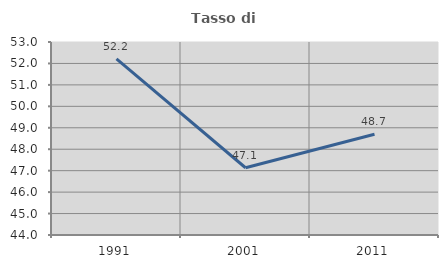
| Category | Tasso di occupazione   |
|---|---|
| 1991.0 | 52.215 |
| 2001.0 | 47.136 |
| 2011.0 | 48.697 |